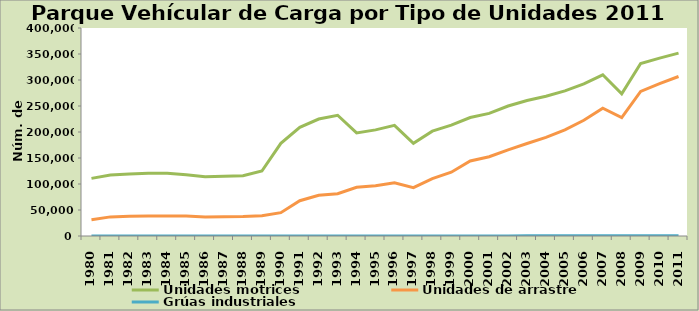
| Category | Unidades motrices | Unidades de arrastre | Grúas industriales |
|---|---|---|---|
| 1980.0 | 110810 | 31120 | 0 |
| 1981.0 | 117090 | 36760 | 0 |
| 1982.0 | 119309 | 38216 | 0 |
| 1983.0 | 120702 | 38639 | 0 |
| 1984.0 | 120702 | 38639 | 0 |
| 1985.0 | 117956 | 38317 | 0 |
| 1986.0 | 114000 | 36500 | 0 |
| 1987.0 | 115092 | 37245 | 0 |
| 1988.0 | 115897 | 37506 | 0 |
| 1989.0 | 124897 | 39113 | 0 |
| 1990.0 | 178130 | 44853 | 0 |
| 1991.0 | 209060 | 67865 | 0 |
| 1992.0 | 224913 | 78233 | 0 |
| 1993.0 | 232203 | 81307 | 0 |
| 1994.0 | 198273 | 93827 | 0 |
| 1995.0 | 204117 | 96638 | 0 |
| 1996.0 | 212909 | 102409 | 0 |
| 1997.0 | 178332 | 92999 | 0 |
| 1998.0 | 201587 | 110530 | 0 |
| 1999.0 | 213292 | 122619 | 126 |
| 2000.0 | 227847 | 144225 | 191 |
| 2001.0 | 235767 | 152341 | 212 |
| 2002.0 | 250025 | 165601 | 221 |
| 2003.0 | 260645 | 177864 | 251 |
| 2004.0 | 268725 | 189568 | 256 |
| 2005.0 | 279112 | 204186 | 266 |
| 2006.0 | 292418 | 222580 | 281 |
| 2007.0 | 310013 | 245843 | 294 |
| 2008.0 | 273455 | 227806 | 277 |
| 2009.0 | 331686 | 278133 | 329 |
| 2010.0 | 342064 | 293053 | 351 |
| 2011.0 | 351705 | 306700 | 355 |